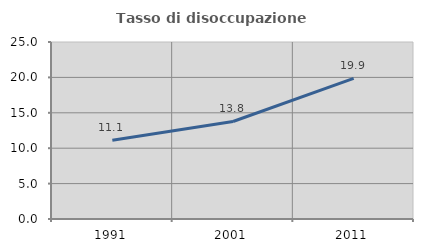
| Category | Tasso di disoccupazione giovanile  |
|---|---|
| 1991.0 | 11.111 |
| 2001.0 | 13.776 |
| 2011.0 | 19.853 |